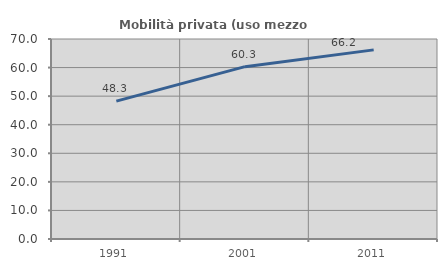
| Category | Mobilità privata (uso mezzo privato) |
|---|---|
| 1991.0 | 48.252 |
| 2001.0 | 60.326 |
| 2011.0 | 66.19 |